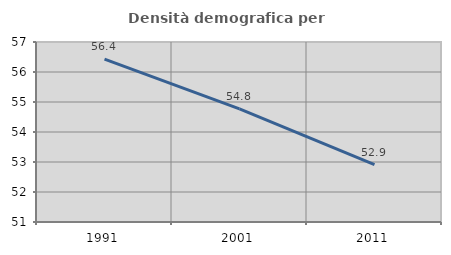
| Category | Densità demografica |
|---|---|
| 1991.0 | 56.432 |
| 2001.0 | 54.769 |
| 2011.0 | 52.911 |